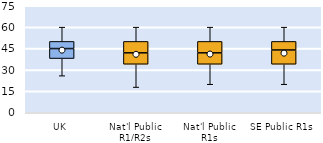
| Category | 25th | 50th | 75th |
|---|---|---|---|
| UK | 38 | 7 | 5 |
| Nat'l Public R1/R2s | 34 | 8 | 8 |
| Nat'l Public R1s | 34 | 8 | 8 |
| SE Public R1s | 34 | 10 | 6 |